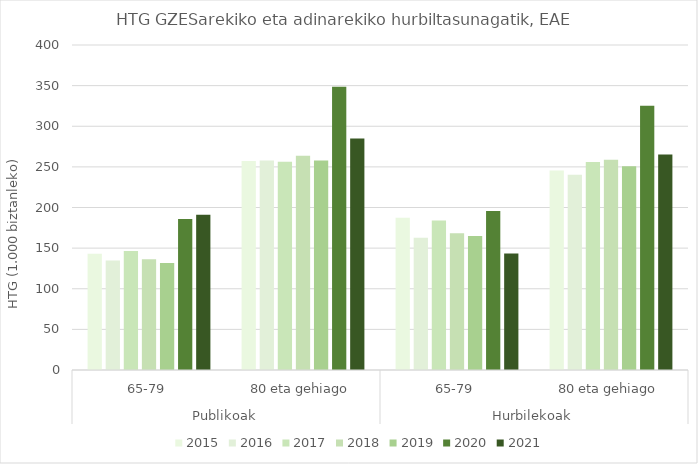
| Category | 2015 | 2016 | 2017 | 2018 | 2019 | 2020 | 2021 |
|---|---|---|---|---|---|---|---|
| 0 | 142.98 | 134.917 | 146.588 | 136.439 | 131.631 | 185.874 | 191.212 |
| 1 | 257.127 | 257.819 | 256.41 | 263.683 | 257.978 | 348.475 | 284.87 |
| 2 | 187.328 | 162.884 | 184.08 | 168.421 | 164.925 | 195.54 | 143.47 |
| 3 | 245.432 | 240.217 | 256.063 | 258.678 | 250.638 | 325.24 | 265.274 |